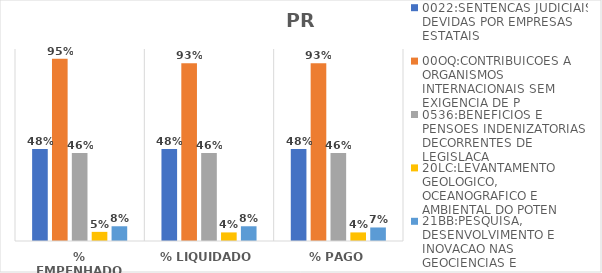
| Category | 0022:SENTENCAS JUDICIAIS DEVIDAS POR EMPRESAS ESTATAIS | 00OQ:CONTRIBUICOES A ORGANISMOS INTERNACIONAIS SEM EXIGENCIA DE P | 0536:BENEFICIOS E PENSOES INDENIZATORIAS DECORRENTES DE LEGISLACA | 20LC:LEVANTAMENTO GEOLOGICO, OCEANOGRAFICO E AMBIENTAL DO POTEN | 21BB:PESQUISA, DESENVOLVIMENTO E INOVACAO NAS GEOCIENCIAS E |
|---|---|---|---|---|---|
| % EMPENHADO | 0.479 | 0.95 | 0.459 | 0.048 | 0.077 |
| % LIQUIDADO | 0.479 | 0.926 | 0.459 | 0.045 | 0.077 |
| % PAGO | 0.479 | 0.926 | 0.459 | 0.045 | 0.07 |